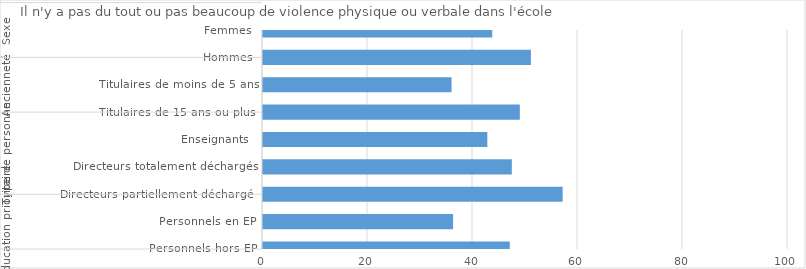
| Category | Series 0 |
|---|---|
| 0 | 47.009 |
| 1 | 36.205 |
| 2 | 57.079 |
| 3 | 47.394 |
| 4 | 42.729 |
| 5 | 48.921 |
| 6 | 35.917 |
| 7 | 51.036 |
| 8 | 43.667 |